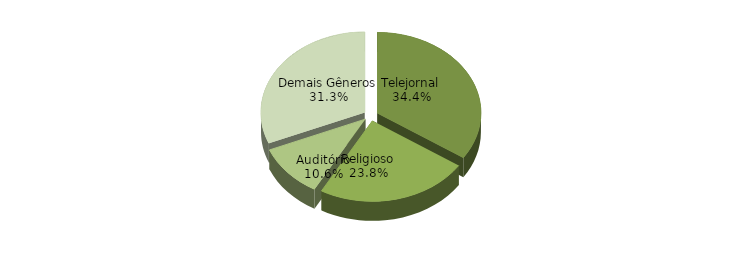
| Category | Total |
|---|---|
| Telejornal | 180637 |
| Religioso | 124868 |
| Auditório | 55605 |
| Demais Gêneros | 164205 |